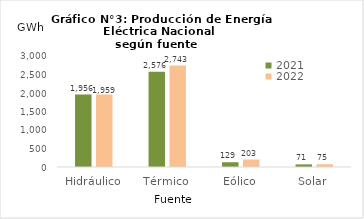
| Category | 2021 | 2022 |
|---|---|---|
| Hidráulico | 1956.484 | 1958.599 |
| Térmico | 2576.029 | 2742.552 |
| Eólico | 128.847 | 202.557 |
| Solar | 70.822 | 75.047 |